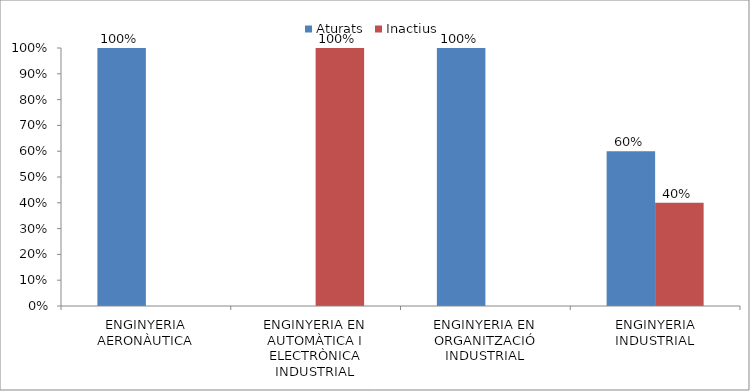
| Category | Aturats | Inactius |
|---|---|---|
| ENGINYERIA AERONÀUTICA | 1 | 0 |
| ENGINYERIA EN AUTOMÀTICA I ELECTRÒNICA INDUSTRIAL | 0 | 1 |
| ENGINYERIA EN ORGANITZACIÓ INDUSTRIAL | 1 | 0 |
| ENGINYERIA INDUSTRIAL | 0.6 | 0.4 |